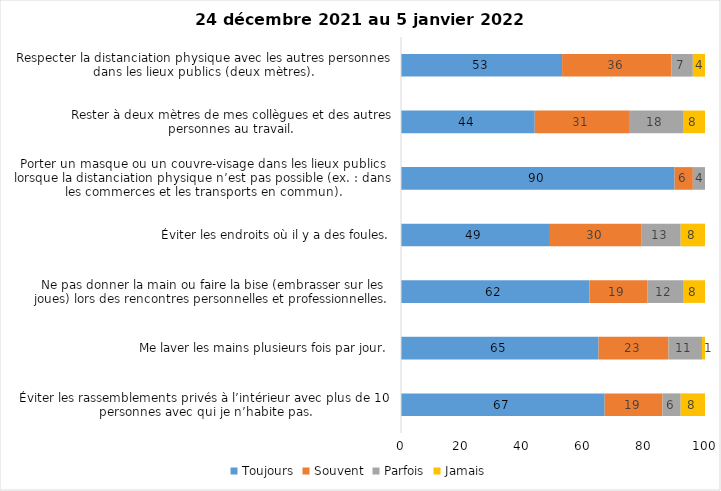
| Category | Toujours | Souvent | Parfois | Jamais |
|---|---|---|---|---|
| Éviter les rassemblements privés à l’intérieur avec plus de 10 personnes avec qui je n’habite pas. | 67 | 19 | 6 | 8 |
| Me laver les mains plusieurs fois par jour. | 65 | 23 | 11 | 1 |
| Ne pas donner la main ou faire la bise (embrasser sur les joues) lors des rencontres personnelles et professionnelles. | 62 | 19 | 12 | 8 |
| Éviter les endroits où il y a des foules. | 49 | 30 | 13 | 8 |
| Porter un masque ou un couvre-visage dans les lieux publics lorsque la distanciation physique n’est pas possible (ex. : dans les commerces et les transports en commun). | 90 | 6 | 4 | 0 |
| Rester à deux mètres de mes collègues et des autres personnes au travail. | 44 | 31 | 18 | 8 |
| Respecter la distanciation physique avec les autres personnes dans les lieux publics (deux mètres). | 53 | 36 | 7 | 4 |